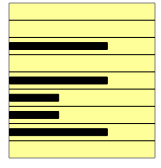
| Category | Series 0 |
|---|---|
| 0 | 0 |
| 1 | 0 |
| 2 | 0.667 |
| 3 | 0 |
| 4 | 0.667 |
| 5 | 0.333 |
| 6 | 0.333 |
| 7 | 0.667 |
| 8 | 0 |